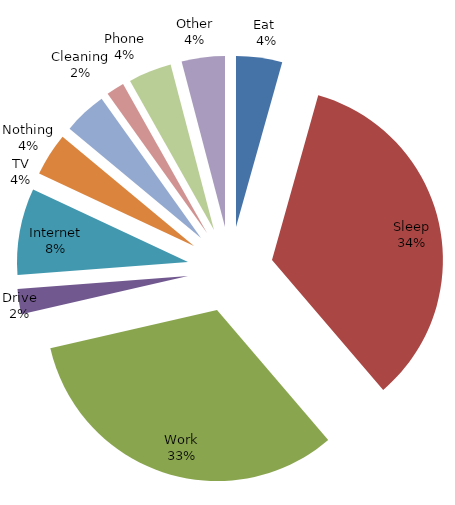
| Category | Series 0 |
|---|---|
| Eat  | 1.067 |
| Sleep | 8.417 |
| Work | 8 |
| Drive | 0.583 |
| Internet | 2 |
| Nothing | 1 |
| TV | 1 |
| Cleaning | 0.417 |
| Phone | 1 |
| Other | 1 |